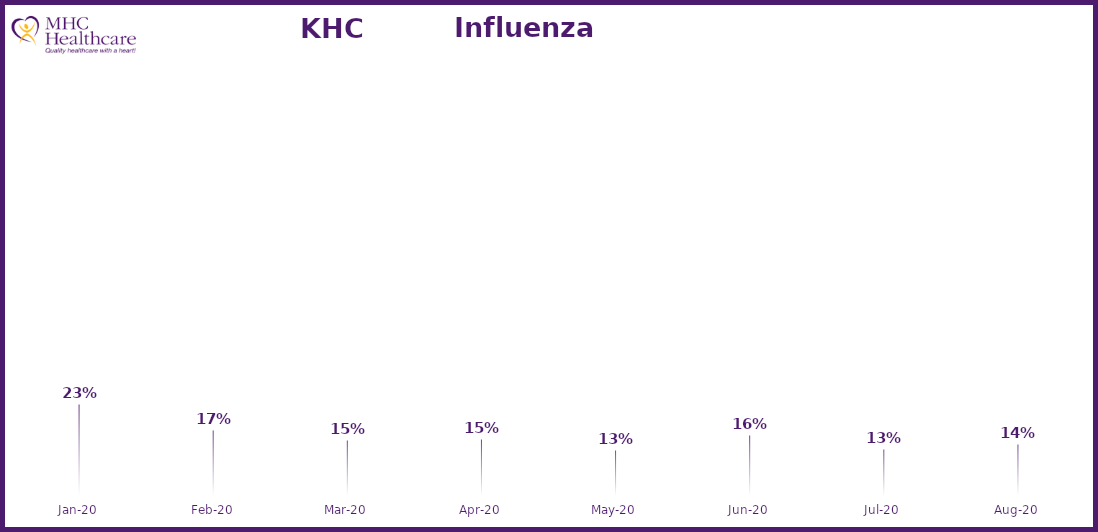
| Category | Online Access to Health Information |
|---|---|
| 2020-01-01 | 0.233 |
| 2020-02-01 | 0.174 |
| 2020-03-01 | 0.152 |
| 2020-04-01 | 0.152 |
| 2020-05-01 | 0.128 |
| 2020-06-01 | 0.161 |
| 2020-07-01 | 0.13 |
| 2020-08-01 | 0.142 |